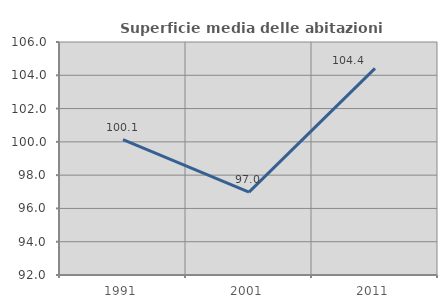
| Category | Superficie media delle abitazioni occupate |
|---|---|
| 1991.0 | 100.137 |
| 2001.0 | 96.983 |
| 2011.0 | 104.412 |